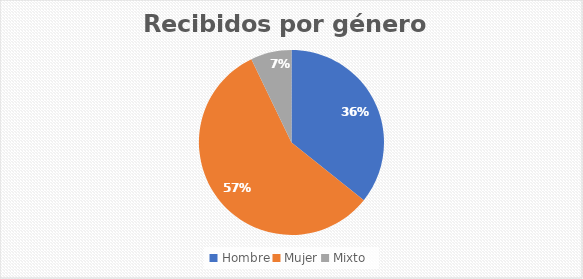
| Category | Recibidos por género  Cantidad |
|---|---|
| Hombre | 5 |
| Mujer | 8 |
| Mixto | 1 |